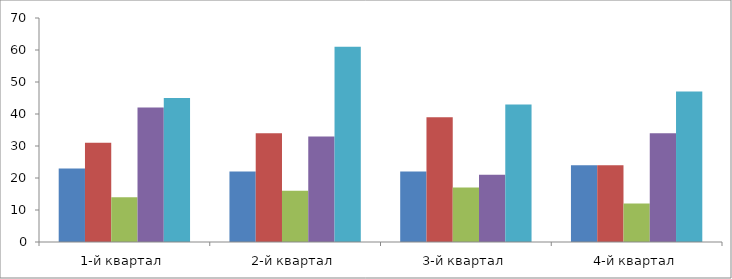
| Category | Сливочный | Люкс | Вечерний звон | Мечта | Российский |
|---|---|---|---|---|---|
| 1-й квартал | 23 | 31 | 14 | 42 | 45 |
| 2-й квартал | 22 | 34 | 16 | 33 | 61 |
| 3-й квартал | 22 | 39 | 17 | 21 | 43 |
| 4-й квартал | 24 | 24 | 12 | 34 | 47 |